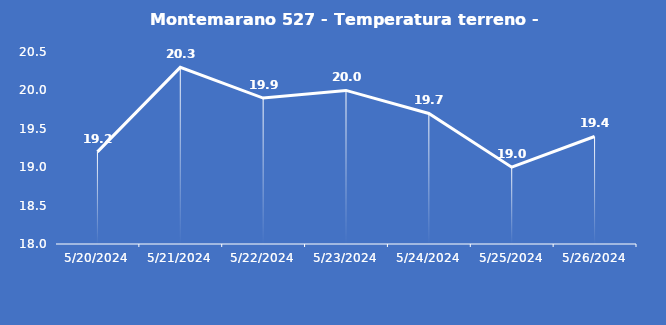
| Category | Montemarano 527 - Temperatura terreno - Grezzo (°C) |
|---|---|
| 5/20/24 | 19.2 |
| 5/21/24 | 20.3 |
| 5/22/24 | 19.9 |
| 5/23/24 | 20 |
| 5/24/24 | 19.7 |
| 5/25/24 | 19 |
| 5/26/24 | 19.4 |